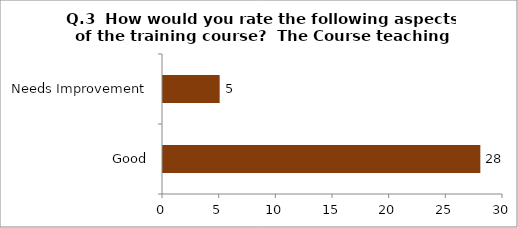
| Category | Q.3  How would you rate the following aspects of the training course?  The Course teaching hours |
|---|---|
| Good | 28 |
| Needs Improvement | 5 |